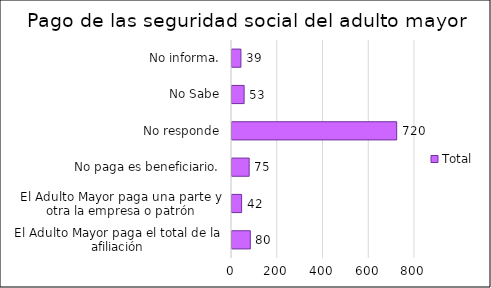
| Category | Total |
|---|---|
| El Adulto Mayor paga el total de la afiliación | 80 |
| El Adulto Mayor paga una parte y otra la empresa o patrón | 42 |
| No paga es beneficiario. | 75 |
| No responde | 720 |
| No Sabe, No informa. | 53 |
| Recibe un apoyo familiar. | 39 |